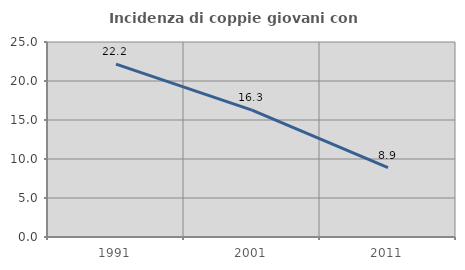
| Category | Incidenza di coppie giovani con figli |
|---|---|
| 1991.0 | 22.162 |
| 2001.0 | 16.259 |
| 2011.0 | 8.9 |